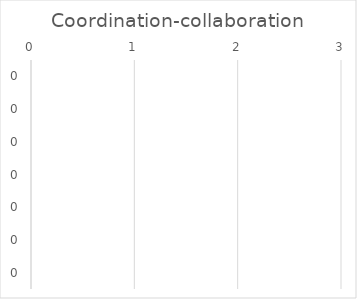
| Category | Coordination-collaboration |
|---|---|
| 0.0 | 0 |
| 0.0 | 0 |
| 0.0 | 0 |
| 0.0 | 0 |
| 0.0 | 0 |
| 0.0 | 0 |
| 0.0 | 0 |